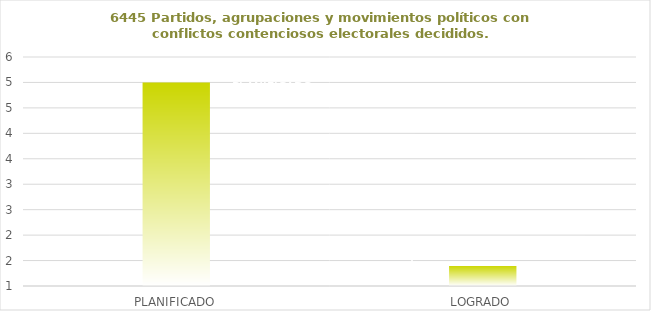
| Category | 6445 |
|---|---|
| PLANIFICADO | 5 |
| LOGRADO | 1.4 |